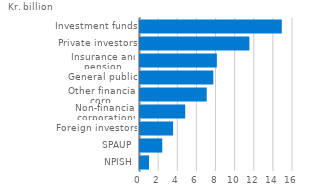
| Category | Net transactions |
|---|---|
| NPISH | 943708924.898 |
| SPAUP | 2328878262.322 |
| Foreign investors | 3456326283.947 |
| Non-financial corporations | 4726830000.041 |
| Other financial corp. | 6979881145.702 |
| General public | 7670199116.439 |
| Insurance and pension | 8038875018.049 |
| Private investors | 11439752841.271 |
| Investment funds | 14828821794.834 |